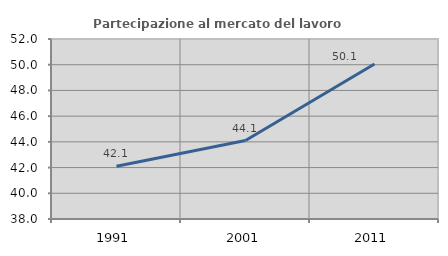
| Category | Partecipazione al mercato del lavoro  femminile |
|---|---|
| 1991.0 | 42.103 |
| 2001.0 | 44.103 |
| 2011.0 | 50.059 |